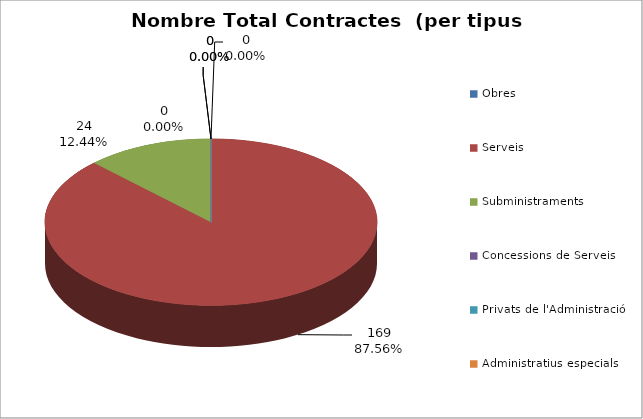
| Category | Nombre Total Contractes |
|---|---|
| Obres | 0 |
| Serveis | 169 |
| Subministraments | 24 |
| Concessions de Serveis | 0 |
| Privats de l'Administració | 0 |
| Administratius especials | 0 |